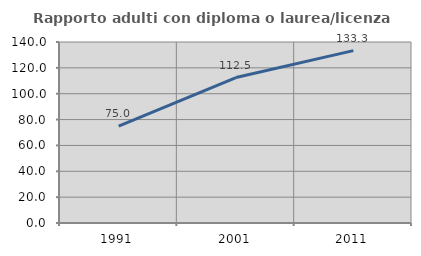
| Category | Rapporto adulti con diploma o laurea/licenza media  |
|---|---|
| 1991.0 | 75 |
| 2001.0 | 112.5 |
| 2011.0 | 133.333 |